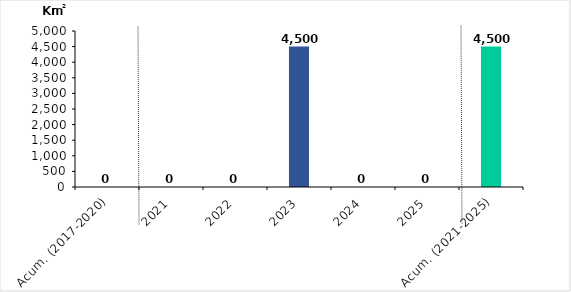
| Category | Series 0 |
|---|---|
| Acum. (2017-2020) | 0 |
| 2021 | 0 |
| 2022 | 0 |
| 2023 | 4500 |
| 2024 | 0 |
| 2025 | 0 |
| Acum. (2021-2025) | 4500 |